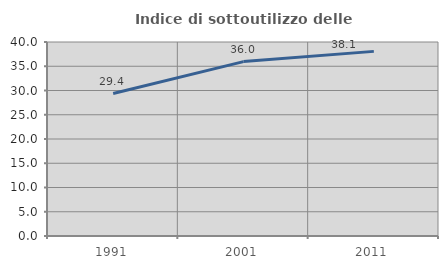
| Category | Indice di sottoutilizzo delle abitazioni  |
|---|---|
| 1991.0 | 29.366 |
| 2001.0 | 35.962 |
| 2011.0 | 38.066 |